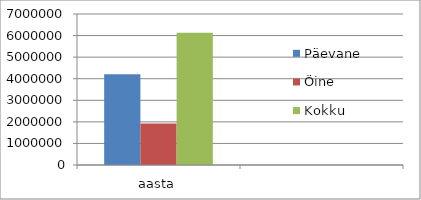
| Category | Päevane | Öine | Kokku |
|---|---|---|---|
| aasta | 4207495.455 | 1919302.294 | 6126797.749 |